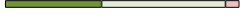
| Category | Series 0 | Series 1 | Series 2 | Series 3 |
|---|---|---|---|---|
| 0 | 7 | 9 | 1 | 0 |